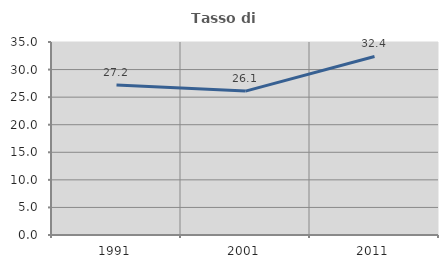
| Category | Tasso di occupazione   |
|---|---|
| 1991.0 | 27.199 |
| 2001.0 | 26.097 |
| 2011.0 | 32.382 |